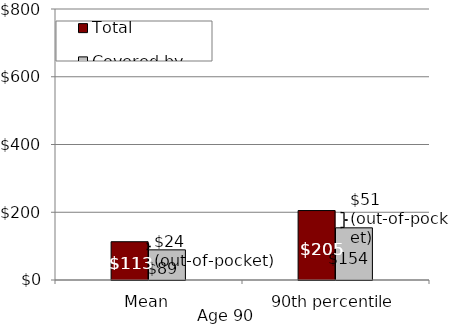
| Category | Total | Covered by insurance |
|---|---|---|
| Mean | 113 | 89 |
| 90th percentile | 205 | 154 |